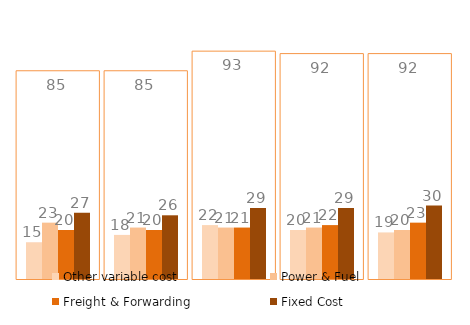
| Category | Total Cost |
|---|---|
| 2011 | 85 |
| 2012 | 85 |
| 2013 | 93 |
| 2014 | 92 |
| 2015 | 92 |